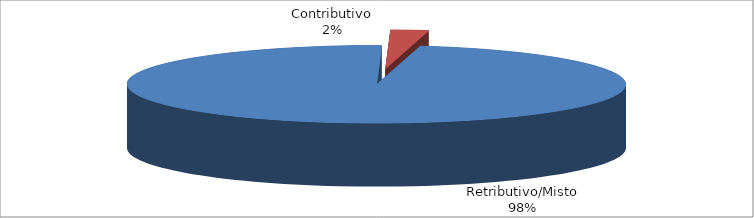
| Category | Series 1 |
|---|---|
| Retributivo/Misto | 91666 |
| Contributivo | 2304 |